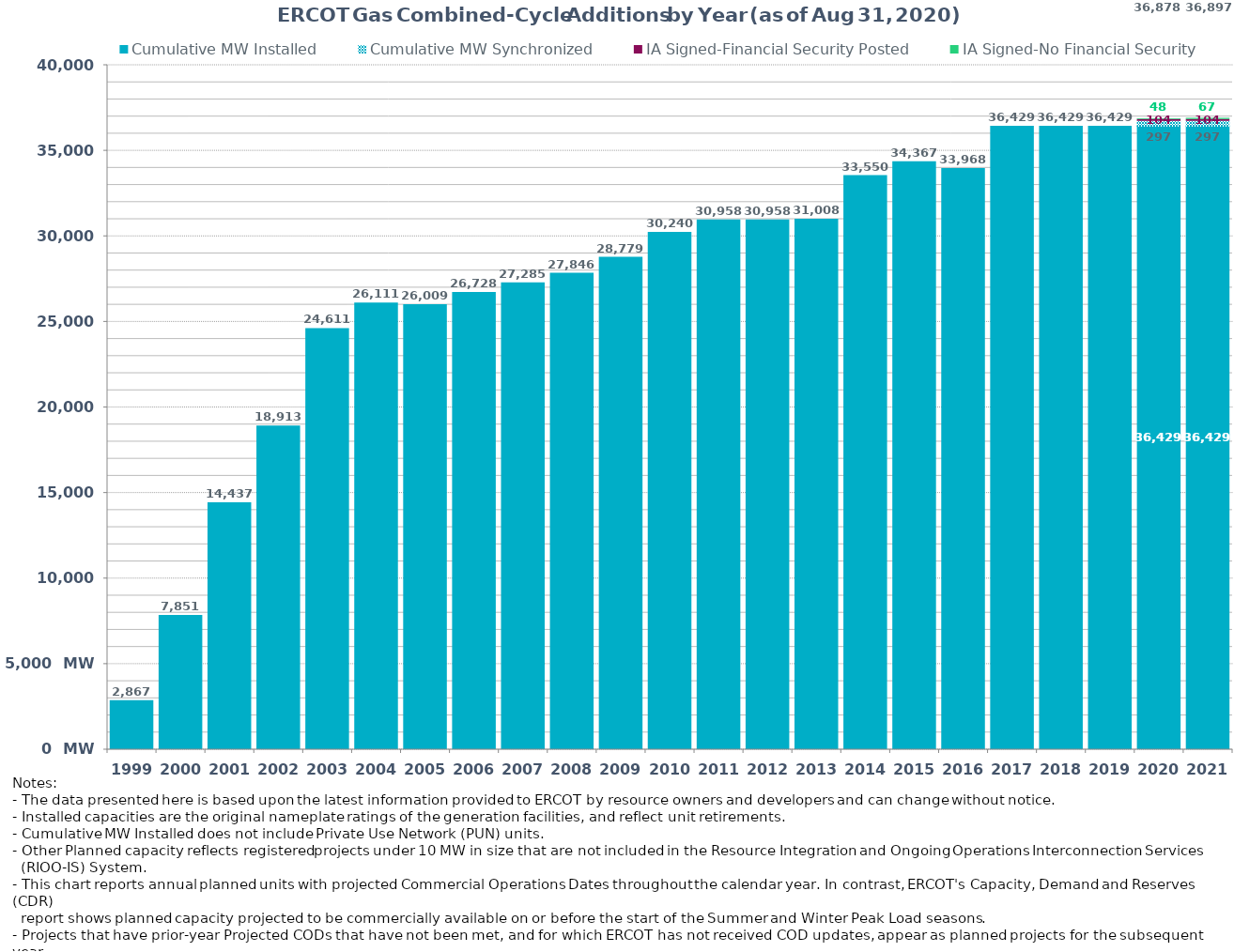
| Category | Cumulative MW Installed | Cumulative MW Synchronized | IA Signed-Financial Security Posted  | IA Signed-No Financial Security  | Other Planned | Cumulative Installed and Planned |
|---|---|---|---|---|---|---|
| 1999.0 | 2867 | 0 | 0 | 0 | 0 | 2867 |
| 2000.0 | 7851 | 0 | 0 | 0 | 0 | 7851 |
| 2001.0 | 14437 | 0 | 0 | 0 | 0 | 14437 |
| 2002.0 | 18913 | 0 | 0 | 0 | 0 | 18913 |
| 2003.0 | 24611 | 0 | 0 | 0 | 0 | 24611 |
| 2004.0 | 26111 | 0 | 0 | 0 | 0 | 26111 |
| 2005.0 | 26009 | 0 | 0 | 0 | 0 | 26009 |
| 2006.0 | 26728 | 0 | 0 | 0 | 0 | 26728 |
| 2007.0 | 27285 | 0 | 0 | 0 | 0 | 27285 |
| 2008.0 | 27846 | 0 | 0 | 0 | 0 | 27846 |
| 2009.0 | 28779 | 0 | 0 | 0 | 0 | 28779 |
| 2010.0 | 30240 | 0 | 0 | 0 | 0 | 30240 |
| 2011.0 | 30958 | 0 | 0 | 0 | 0 | 30958 |
| 2012.0 | 30958 | 0 | 0 | 0 | 0 | 30958 |
| 2013.0 | 31008 | 0 | 0 | 0 | 0 | 31008 |
| 2014.0 | 33550 | 0 | 0 | 0 | 0 | 33550 |
| 2015.0 | 34367 | 0 | 0 | 0 | 0 | 34367 |
| 2016.0 | 33968 | 0 | 0 | 0 | 0 | 33968 |
| 2017.0 | 36429 | 0 | 0 | 0 | 0 | 36429 |
| 2018.0 | 36429 | 0 | 0 | 0 | 0 | 36429 |
| 2019.0 | 36429 | 0 | 0 | 0 | 0 | 36429 |
| 2020.0 | 36429 | 297 | 104 | 48 | 0 | 36878 |
| 2021.0 | 36429 | 297 | 104 | 67 | 0 | 36897 |